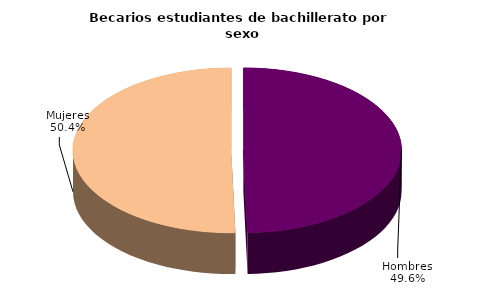
| Category | Series 0 |
|---|---|
| Hombres | 54556 |
| Mujeres | 55488 |